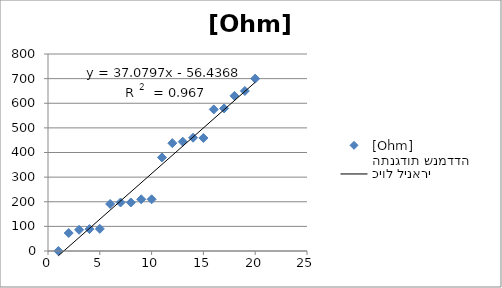
| Category | התנגדות שנמדדה [Ohm] |
|---|---|
| 0 | 0 |
| 1 | 73 |
| 2 | 86 |
| 3 | 89 |
| 4 | 90 |
| 5 | 191 |
| 6 | 197 |
| 7 | 197 |
| 8 | 210 |
| 9 | 210 |
| 10 | 380 |
| 11 | 438 |
| 12 | 444 |
| 13 | 460 |
| 14 | 459 |
| 15 | 575 |
| 16 | 579 |
| 17 | 630 |
| 18 | 650 |
| 19 | 700 |